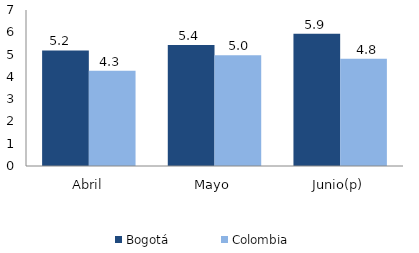
| Category | Bogotá | Colombia |
|---|---|---|
| Abril | 5.186 | 4.275 |
| Mayo | 5.431 | 4.971 |
| Junio(p) | 5.93 | 4.816 |